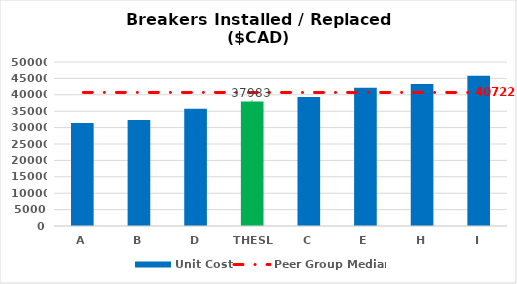
| Category | Unit Cost |
|---|---|
| A | 31406.85 |
| B | 32321.898 |
| D | 35760.996 |
| THESL | 37983 |
| C | 39301.056 |
| E | 42142.05 |
| H | 43285.451 |
| I | 45836.275 |